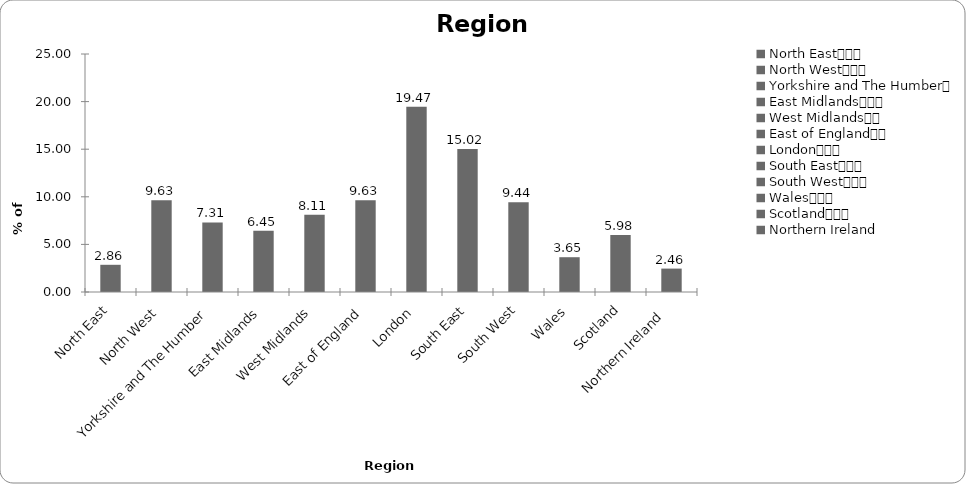
| Category | Region |
|---|---|
| North East			 | 2.857 |
| North West			 | 9.635 |
| Yorkshire and The Humber	 | 7.309 |
| East Midlands			 | 6.445 |
| West Midlands		 | 8.106 |
| East of England		 | 9.635 |
| London			 | 19.468 |
| South East			 | 15.017 |
| South West			 | 9.435 |
| Wales			 | 3.654 |
| Scotland			 | 5.98 |
| Northern Ireland  | 2.458 |